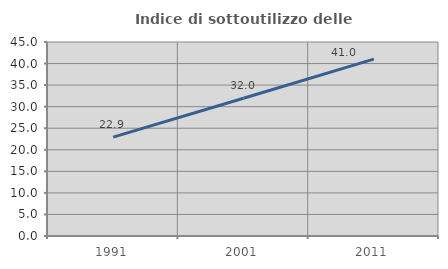
| Category | Indice di sottoutilizzo delle abitazioni  |
|---|---|
| 1991.0 | 22.93 |
| 2001.0 | 31.959 |
| 2011.0 | 41.037 |